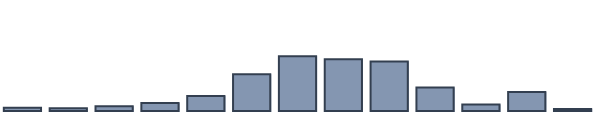
| Category | Series 0 |
|---|---|
| 0 | 1.176 |
| 1 | 0.98 |
| 2 | 1.715 |
| 3 | 2.891 |
| 4 | 5.439 |
| 5 | 13.229 |
| 6 | 19.696 |
| 7 | 18.667 |
| 8 | 17.834 |
| 9 | 8.476 |
| 10 | 2.303 |
| 11 | 6.859 |
| 12 | 0.735 |